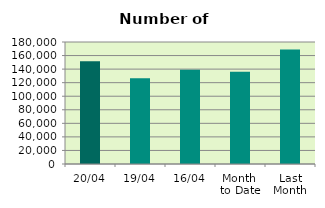
| Category | Series 0 |
|---|---|
| 20/04 | 151430 |
| 19/04 | 126448 |
| 16/04 | 139018 |
| Month 
to Date | 136202.667 |
| Last
Month | 168827.304 |